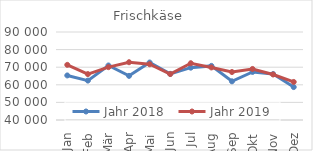
| Category | Jahr 2018 | Jahr 2019 |
|---|---|---|
| Jan | 65315.47 | 71331.39 |
| Feb | 62392.769 | 66085.73 |
| Mär | 70979.852 | 70026.971 |
| Apr | 65069.577 | 72823.555 |
| Mai | 72654.726 | 71685.836 |
| Jun | 66205.479 | 66111.212 |
| Jul | 69735.956 | 72256.739 |
| Aug | 70741.914 | 69864.079 |
| Sep | 61978.78 | 67261.39 |
| Okt | 67314.856 | 68996.678 |
| Nov | 66117.598 | 65862.787 |
| Dez | 58705.312 | 61623.478 |